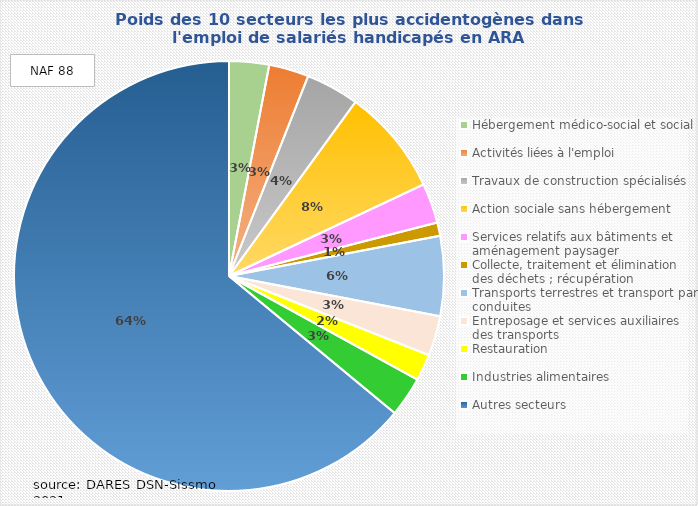
| Category | Series 0 |
|---|---|
| Hébergement médico-social et social | 0.03 |
| Activités liées à l'emploi | 0.03 |
| Travaux de construction spécialisés | 0.04 |
| Action sociale sans hébergement | 0.08 |
| Services relatifs aux bâtiments et aménagement paysager | 0.03 |
| Collecte, traitement et élimination des déchets ; récupération | 0.01 |
| Transports terrestres et transport par conduites | 0.06 |
| Entreposage et services auxiliaires des transports | 0.03 |
| Restauration | 0.02 |
| Industries alimentaires | 0.03 |
| Autres secteurs | 0.64 |